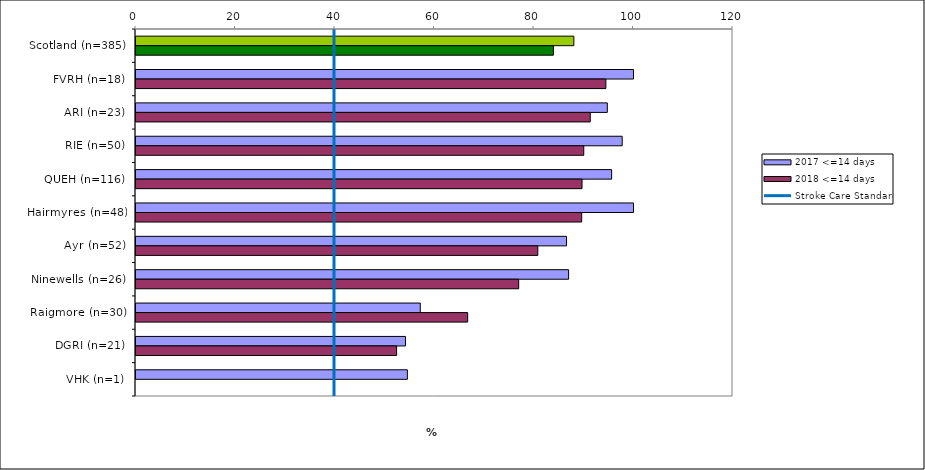
| Category | 2017 <=14 days | 2018 <=14 days |
|---|---|---|
| Scotland (n=385) | 88.012 | 83.896 |
| FVRH (n=18) | 100 | 94.444 |
| ARI (n=23) | 94.737 | 91.304 |
| RIE (n=50) | 97.727 | 90 |
| QUEH (n=116) | 95.604 | 89.655 |
| Hairmyres (n=48) | 100 | 89.583 |
| Ayr (n=52) | 86.538 | 80.769 |
| Ninewells (n=26) | 86.957 | 76.923 |
| Raigmore (n=30) | 57.143 | 66.667 |
| DGRI (n=21) | 54.167 | 52.381 |
| VHK (n=1) | 54.545 | 0 |